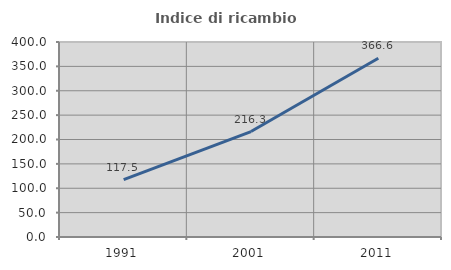
| Category | Indice di ricambio occupazionale  |
|---|---|
| 1991.0 | 117.507 |
| 2001.0 | 216.292 |
| 2011.0 | 366.562 |